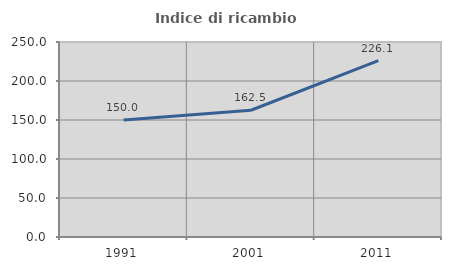
| Category | Indice di ricambio occupazionale  |
|---|---|
| 1991.0 | 150 |
| 2001.0 | 162.5 |
| 2011.0 | 226.061 |